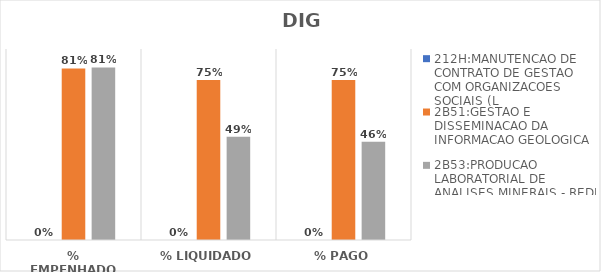
| Category | 212H:MANUTENCAO DE CONTRATO DE GESTAO COM ORGANIZACOES SOCIAIS (L | 2B51:GESTAO E DISSEMINACAO DA INFORMACAO GEOLOGICA | 2B53:PRODUCAO LABORATORIAL DE ANALISES MINERAIS - REDE LAMIN |
|---|---|---|---|
| % EMPENHADO | 0 | 0.808 | 0.813 |
| % LIQUIDADO | 0 | 0.754 | 0.486 |
| % PAGO | 0 | 0.754 | 0.463 |